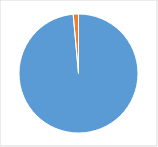
| Category | Series 0 |
|---|---|
| 0 | 0.986 |
| 1 | 0.014 |
| 2 | 0 |